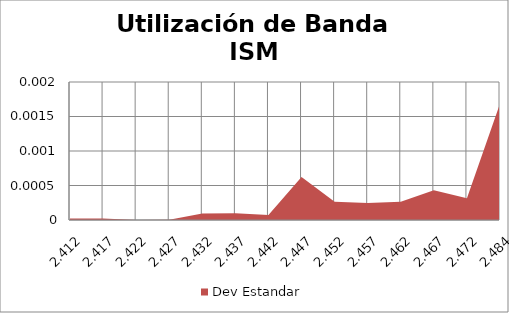
| Category | Dev Estandar |
|---|---|
| 2.412 | 0 |
| 2.417 | 0 |
| 2.4219999999999997 | 0 |
| 2.4269999999999996 | 0 |
| 2.4319999999999995 | 0 |
| 2.4369999999999994 | 0 |
| 2.4419999999999993 | 0 |
| 2.446999999999999 | 0.001 |
| 2.451999999999999 | 0 |
| 2.456999999999999 | 0 |
| 2.461999999999999 | 0 |
| 2.4669999999999987 | 0 |
| 2.4719999999999986 | 0 |
| 2.484 | 0.002 |